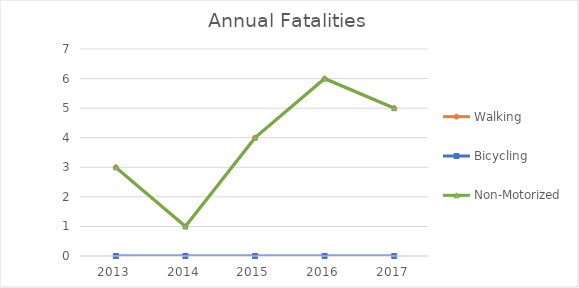
| Category | Walking | Bicycling | Non-Motorized |
|---|---|---|---|
| 2013 | 3 | 0 | 3 |
| 2014 | 1 | 0 | 1 |
| 2015 | 4 | 0 | 4 |
| 2016 | 6 | 0 | 6 |
| 2017 | 5 | 0 | 5 |